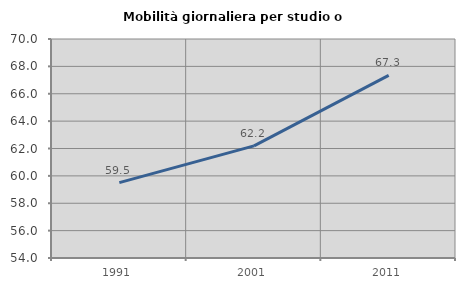
| Category | Mobilità giornaliera per studio o lavoro |
|---|---|
| 1991.0 | 59.509 |
| 2001.0 | 62.191 |
| 2011.0 | 67.344 |